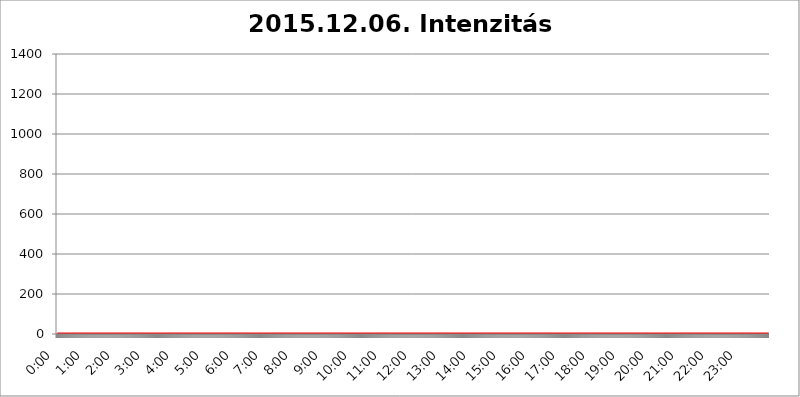
| Category | 2015.12.06. Intenzitás [W/m^2] |
|---|---|
| 0.0 | 0 |
| 0.0006944444444444445 | 0 |
| 0.001388888888888889 | 0 |
| 0.0020833333333333333 | 0 |
| 0.002777777777777778 | 0 |
| 0.003472222222222222 | 0 |
| 0.004166666666666667 | 0 |
| 0.004861111111111111 | 0 |
| 0.005555555555555556 | 0 |
| 0.0062499999999999995 | 0 |
| 0.006944444444444444 | 0 |
| 0.007638888888888889 | 0 |
| 0.008333333333333333 | 0 |
| 0.009027777777777779 | 0 |
| 0.009722222222222222 | 0 |
| 0.010416666666666666 | 0 |
| 0.011111111111111112 | 0 |
| 0.011805555555555555 | 0 |
| 0.012499999999999999 | 0 |
| 0.013194444444444444 | 0 |
| 0.013888888888888888 | 0 |
| 0.014583333333333332 | 0 |
| 0.015277777777777777 | 0 |
| 0.015972222222222224 | 0 |
| 0.016666666666666666 | 0 |
| 0.017361111111111112 | 0 |
| 0.018055555555555557 | 0 |
| 0.01875 | 0 |
| 0.019444444444444445 | 0 |
| 0.02013888888888889 | 0 |
| 0.020833333333333332 | 0 |
| 0.02152777777777778 | 0 |
| 0.022222222222222223 | 0 |
| 0.02291666666666667 | 0 |
| 0.02361111111111111 | 0 |
| 0.024305555555555556 | 0 |
| 0.024999999999999998 | 0 |
| 0.025694444444444447 | 0 |
| 0.02638888888888889 | 0 |
| 0.027083333333333334 | 0 |
| 0.027777777777777776 | 0 |
| 0.02847222222222222 | 0 |
| 0.029166666666666664 | 0 |
| 0.029861111111111113 | 0 |
| 0.030555555555555555 | 0 |
| 0.03125 | 0 |
| 0.03194444444444445 | 0 |
| 0.03263888888888889 | 0 |
| 0.03333333333333333 | 0 |
| 0.034027777777777775 | 0 |
| 0.034722222222222224 | 0 |
| 0.035416666666666666 | 0 |
| 0.036111111111111115 | 0 |
| 0.03680555555555556 | 0 |
| 0.0375 | 0 |
| 0.03819444444444444 | 0 |
| 0.03888888888888889 | 0 |
| 0.03958333333333333 | 0 |
| 0.04027777777777778 | 0 |
| 0.04097222222222222 | 0 |
| 0.041666666666666664 | 0 |
| 0.042361111111111106 | 0 |
| 0.04305555555555556 | 0 |
| 0.043750000000000004 | 0 |
| 0.044444444444444446 | 0 |
| 0.04513888888888889 | 0 |
| 0.04583333333333334 | 0 |
| 0.04652777777777778 | 0 |
| 0.04722222222222222 | 0 |
| 0.04791666666666666 | 0 |
| 0.04861111111111111 | 0 |
| 0.049305555555555554 | 0 |
| 0.049999999999999996 | 0 |
| 0.05069444444444445 | 0 |
| 0.051388888888888894 | 0 |
| 0.052083333333333336 | 0 |
| 0.05277777777777778 | 0 |
| 0.05347222222222222 | 0 |
| 0.05416666666666667 | 0 |
| 0.05486111111111111 | 0 |
| 0.05555555555555555 | 0 |
| 0.05625 | 0 |
| 0.05694444444444444 | 0 |
| 0.057638888888888885 | 0 |
| 0.05833333333333333 | 0 |
| 0.05902777777777778 | 0 |
| 0.059722222222222225 | 0 |
| 0.06041666666666667 | 0 |
| 0.061111111111111116 | 0 |
| 0.06180555555555556 | 0 |
| 0.0625 | 0 |
| 0.06319444444444444 | 0 |
| 0.06388888888888888 | 0 |
| 0.06458333333333334 | 0 |
| 0.06527777777777778 | 0 |
| 0.06597222222222222 | 0 |
| 0.06666666666666667 | 0 |
| 0.06736111111111111 | 0 |
| 0.06805555555555555 | 0 |
| 0.06874999999999999 | 0 |
| 0.06944444444444443 | 0 |
| 0.07013888888888889 | 0 |
| 0.07083333333333333 | 0 |
| 0.07152777777777779 | 0 |
| 0.07222222222222223 | 0 |
| 0.07291666666666667 | 0 |
| 0.07361111111111111 | 0 |
| 0.07430555555555556 | 0 |
| 0.075 | 0 |
| 0.07569444444444444 | 0 |
| 0.0763888888888889 | 0 |
| 0.07708333333333334 | 0 |
| 0.07777777777777778 | 0 |
| 0.07847222222222222 | 0 |
| 0.07916666666666666 | 0 |
| 0.0798611111111111 | 0 |
| 0.08055555555555556 | 0 |
| 0.08125 | 0 |
| 0.08194444444444444 | 0 |
| 0.08263888888888889 | 0 |
| 0.08333333333333333 | 0 |
| 0.08402777777777777 | 0 |
| 0.08472222222222221 | 0 |
| 0.08541666666666665 | 0 |
| 0.08611111111111112 | 0 |
| 0.08680555555555557 | 0 |
| 0.08750000000000001 | 0 |
| 0.08819444444444445 | 0 |
| 0.08888888888888889 | 0 |
| 0.08958333333333333 | 0 |
| 0.09027777777777778 | 0 |
| 0.09097222222222222 | 0 |
| 0.09166666666666667 | 0 |
| 0.09236111111111112 | 0 |
| 0.09305555555555556 | 0 |
| 0.09375 | 0 |
| 0.09444444444444444 | 0 |
| 0.09513888888888888 | 0 |
| 0.09583333333333333 | 0 |
| 0.09652777777777777 | 0 |
| 0.09722222222222222 | 0 |
| 0.09791666666666667 | 0 |
| 0.09861111111111111 | 0 |
| 0.09930555555555555 | 0 |
| 0.09999999999999999 | 0 |
| 0.10069444444444443 | 0 |
| 0.1013888888888889 | 0 |
| 0.10208333333333335 | 0 |
| 0.10277777777777779 | 0 |
| 0.10347222222222223 | 0 |
| 0.10416666666666667 | 0 |
| 0.10486111111111111 | 0 |
| 0.10555555555555556 | 0 |
| 0.10625 | 0 |
| 0.10694444444444444 | 0 |
| 0.1076388888888889 | 0 |
| 0.10833333333333334 | 0 |
| 0.10902777777777778 | 0 |
| 0.10972222222222222 | 0 |
| 0.1111111111111111 | 0 |
| 0.11180555555555556 | 0 |
| 0.11180555555555556 | 0 |
| 0.1125 | 0 |
| 0.11319444444444444 | 0 |
| 0.11388888888888889 | 0 |
| 0.11458333333333333 | 0 |
| 0.11527777777777777 | 0 |
| 0.11597222222222221 | 0 |
| 0.11666666666666665 | 0 |
| 0.1173611111111111 | 0 |
| 0.11805555555555557 | 0 |
| 0.11944444444444445 | 0 |
| 0.12013888888888889 | 0 |
| 0.12083333333333333 | 0 |
| 0.12152777777777778 | 0 |
| 0.12222222222222223 | 0 |
| 0.12291666666666667 | 0 |
| 0.12291666666666667 | 0 |
| 0.12361111111111112 | 0 |
| 0.12430555555555556 | 0 |
| 0.125 | 0 |
| 0.12569444444444444 | 0 |
| 0.12638888888888888 | 0 |
| 0.12708333333333333 | 0 |
| 0.16875 | 0 |
| 0.12847222222222224 | 0 |
| 0.12916666666666668 | 0 |
| 0.12986111111111112 | 0 |
| 0.13055555555555556 | 0 |
| 0.13125 | 0 |
| 0.13194444444444445 | 0 |
| 0.1326388888888889 | 0 |
| 0.13333333333333333 | 0 |
| 0.13402777777777777 | 0 |
| 0.13402777777777777 | 0 |
| 0.13472222222222222 | 0 |
| 0.13541666666666666 | 0 |
| 0.1361111111111111 | 0 |
| 0.13749999999999998 | 0 |
| 0.13819444444444443 | 0 |
| 0.1388888888888889 | 0 |
| 0.13958333333333334 | 0 |
| 0.14027777777777778 | 0 |
| 0.14097222222222222 | 0 |
| 0.14166666666666666 | 0 |
| 0.1423611111111111 | 0 |
| 0.14305555555555557 | 0 |
| 0.14375000000000002 | 0 |
| 0.14444444444444446 | 0 |
| 0.1451388888888889 | 0 |
| 0.1451388888888889 | 0 |
| 0.14652777777777778 | 0 |
| 0.14722222222222223 | 0 |
| 0.14791666666666667 | 0 |
| 0.1486111111111111 | 0 |
| 0.14930555555555555 | 0 |
| 0.15 | 0 |
| 0.15069444444444444 | 0 |
| 0.15138888888888888 | 0 |
| 0.15208333333333332 | 0 |
| 0.15277777777777776 | 0 |
| 0.15347222222222223 | 0 |
| 0.15416666666666667 | 0 |
| 0.15486111111111112 | 0 |
| 0.15555555555555556 | 0 |
| 0.15625 | 0 |
| 0.15694444444444444 | 0 |
| 0.15763888888888888 | 0 |
| 0.15833333333333333 | 0 |
| 0.15902777777777777 | 0 |
| 0.15972222222222224 | 0 |
| 0.16041666666666668 | 0 |
| 0.16111111111111112 | 0 |
| 0.16180555555555556 | 0 |
| 0.1625 | 0 |
| 0.16319444444444445 | 0 |
| 0.1638888888888889 | 0 |
| 0.16458333333333333 | 0 |
| 0.16527777777777777 | 0 |
| 0.16597222222222222 | 0 |
| 0.16666666666666666 | 0 |
| 0.1673611111111111 | 0 |
| 0.16805555555555554 | 0 |
| 0.16874999999999998 | 0 |
| 0.16944444444444443 | 0 |
| 0.17013888888888887 | 0 |
| 0.1708333333333333 | 0 |
| 0.17152777777777775 | 0 |
| 0.17222222222222225 | 0 |
| 0.1729166666666667 | 0 |
| 0.17361111111111113 | 0 |
| 0.17430555555555557 | 0 |
| 0.17500000000000002 | 0 |
| 0.17569444444444446 | 0 |
| 0.1763888888888889 | 0 |
| 0.17708333333333334 | 0 |
| 0.17777777777777778 | 0 |
| 0.17847222222222223 | 0 |
| 0.17916666666666667 | 0 |
| 0.1798611111111111 | 0 |
| 0.18055555555555555 | 0 |
| 0.18125 | 0 |
| 0.18194444444444444 | 0 |
| 0.1826388888888889 | 0 |
| 0.18333333333333335 | 0 |
| 0.1840277777777778 | 0 |
| 0.18472222222222223 | 0 |
| 0.18541666666666667 | 0 |
| 0.18611111111111112 | 0 |
| 0.18680555555555556 | 0 |
| 0.1875 | 0 |
| 0.18819444444444444 | 0 |
| 0.18888888888888888 | 0 |
| 0.18958333333333333 | 0 |
| 0.19027777777777777 | 0 |
| 0.1909722222222222 | 0 |
| 0.19166666666666665 | 0 |
| 0.19236111111111112 | 0 |
| 0.19305555555555554 | 0 |
| 0.19375 | 0 |
| 0.19444444444444445 | 0 |
| 0.1951388888888889 | 0 |
| 0.19583333333333333 | 0 |
| 0.19652777777777777 | 0 |
| 0.19722222222222222 | 0 |
| 0.19791666666666666 | 0 |
| 0.1986111111111111 | 0 |
| 0.19930555555555554 | 0 |
| 0.19999999999999998 | 0 |
| 0.20069444444444443 | 0 |
| 0.20138888888888887 | 0 |
| 0.2020833333333333 | 0 |
| 0.2027777777777778 | 0 |
| 0.2034722222222222 | 0 |
| 0.2041666666666667 | 0 |
| 0.20486111111111113 | 0 |
| 0.20555555555555557 | 0 |
| 0.20625000000000002 | 0 |
| 0.20694444444444446 | 0 |
| 0.2076388888888889 | 0 |
| 0.20833333333333334 | 0 |
| 0.20902777777777778 | 0 |
| 0.20972222222222223 | 0 |
| 0.21041666666666667 | 0 |
| 0.2111111111111111 | 0 |
| 0.21180555555555555 | 0 |
| 0.2125 | 0 |
| 0.21319444444444444 | 0 |
| 0.2138888888888889 | 0 |
| 0.21458333333333335 | 0 |
| 0.2152777777777778 | 0 |
| 0.21597222222222223 | 0 |
| 0.21666666666666667 | 0 |
| 0.21736111111111112 | 0 |
| 0.21805555555555556 | 0 |
| 0.21875 | 0 |
| 0.21944444444444444 | 0 |
| 0.22013888888888888 | 0 |
| 0.22083333333333333 | 0 |
| 0.22152777777777777 | 0 |
| 0.2222222222222222 | 0 |
| 0.22291666666666665 | 0 |
| 0.2236111111111111 | 0 |
| 0.22430555555555556 | 0 |
| 0.225 | 0 |
| 0.22569444444444445 | 0 |
| 0.2263888888888889 | 0 |
| 0.22708333333333333 | 0 |
| 0.22777777777777777 | 0 |
| 0.22847222222222222 | 0 |
| 0.22916666666666666 | 0 |
| 0.2298611111111111 | 0 |
| 0.23055555555555554 | 0 |
| 0.23124999999999998 | 0 |
| 0.23194444444444443 | 0 |
| 0.23263888888888887 | 0 |
| 0.2333333333333333 | 0 |
| 0.2340277777777778 | 0 |
| 0.2347222222222222 | 0 |
| 0.2354166666666667 | 0 |
| 0.23611111111111113 | 0 |
| 0.23680555555555557 | 0 |
| 0.23750000000000002 | 0 |
| 0.23819444444444446 | 0 |
| 0.2388888888888889 | 0 |
| 0.23958333333333334 | 0 |
| 0.24027777777777778 | 0 |
| 0.24097222222222223 | 0 |
| 0.24166666666666667 | 0 |
| 0.2423611111111111 | 0 |
| 0.24305555555555555 | 0 |
| 0.24375 | 0 |
| 0.24444444444444446 | 0 |
| 0.24513888888888888 | 0 |
| 0.24583333333333335 | 0 |
| 0.2465277777777778 | 0 |
| 0.24722222222222223 | 0 |
| 0.24791666666666667 | 0 |
| 0.24861111111111112 | 0 |
| 0.24930555555555556 | 0 |
| 0.25 | 0 |
| 0.25069444444444444 | 0 |
| 0.2513888888888889 | 0 |
| 0.2520833333333333 | 0 |
| 0.25277777777777777 | 0 |
| 0.2534722222222222 | 0 |
| 0.25416666666666665 | 0 |
| 0.2548611111111111 | 0 |
| 0.2555555555555556 | 0 |
| 0.25625000000000003 | 0 |
| 0.2569444444444445 | 0 |
| 0.2576388888888889 | 0 |
| 0.25833333333333336 | 0 |
| 0.2590277777777778 | 0 |
| 0.25972222222222224 | 0 |
| 0.2604166666666667 | 0 |
| 0.2611111111111111 | 0 |
| 0.26180555555555557 | 0 |
| 0.2625 | 0 |
| 0.26319444444444445 | 0 |
| 0.2638888888888889 | 0 |
| 0.26458333333333334 | 0 |
| 0.2652777777777778 | 0 |
| 0.2659722222222222 | 0 |
| 0.26666666666666666 | 0 |
| 0.2673611111111111 | 0 |
| 0.26805555555555555 | 0 |
| 0.26875 | 0 |
| 0.26944444444444443 | 0 |
| 0.2701388888888889 | 0 |
| 0.2708333333333333 | 0 |
| 0.27152777777777776 | 0 |
| 0.2722222222222222 | 0 |
| 0.27291666666666664 | 0 |
| 0.2736111111111111 | 0 |
| 0.2743055555555555 | 0 |
| 0.27499999999999997 | 0 |
| 0.27569444444444446 | 0 |
| 0.27638888888888885 | 0 |
| 0.27708333333333335 | 0 |
| 0.2777777777777778 | 0 |
| 0.27847222222222223 | 0 |
| 0.2791666666666667 | 0 |
| 0.2798611111111111 | 0 |
| 0.28055555555555556 | 0 |
| 0.28125 | 0 |
| 0.28194444444444444 | 0 |
| 0.2826388888888889 | 0 |
| 0.2833333333333333 | 0 |
| 0.28402777777777777 | 0 |
| 0.2847222222222222 | 0 |
| 0.28541666666666665 | 0 |
| 0.28611111111111115 | 0 |
| 0.28680555555555554 | 0 |
| 0.28750000000000003 | 0 |
| 0.2881944444444445 | 0 |
| 0.2888888888888889 | 0 |
| 0.28958333333333336 | 0 |
| 0.2902777777777778 | 0 |
| 0.29097222222222224 | 0 |
| 0.2916666666666667 | 0 |
| 0.2923611111111111 | 0 |
| 0.29305555555555557 | 0 |
| 0.29375 | 0 |
| 0.29444444444444445 | 0 |
| 0.2951388888888889 | 0 |
| 0.29583333333333334 | 0 |
| 0.2965277777777778 | 0 |
| 0.2972222222222222 | 0 |
| 0.29791666666666666 | 0 |
| 0.2986111111111111 | 0 |
| 0.29930555555555555 | 0 |
| 0.3 | 0 |
| 0.30069444444444443 | 0 |
| 0.3013888888888889 | 0 |
| 0.3020833333333333 | 0 |
| 0.30277777777777776 | 0 |
| 0.3034722222222222 | 0 |
| 0.30416666666666664 | 0 |
| 0.3048611111111111 | 0 |
| 0.3055555555555555 | 0 |
| 0.30624999999999997 | 0 |
| 0.3069444444444444 | 0 |
| 0.3076388888888889 | 0 |
| 0.30833333333333335 | 0 |
| 0.3090277777777778 | 0 |
| 0.30972222222222223 | 0 |
| 0.3104166666666667 | 0 |
| 0.3111111111111111 | 0 |
| 0.31180555555555556 | 0 |
| 0.3125 | 0 |
| 0.31319444444444444 | 0 |
| 0.3138888888888889 | 0 |
| 0.3145833333333333 | 0 |
| 0.31527777777777777 | 0 |
| 0.3159722222222222 | 0 |
| 0.31666666666666665 | 0 |
| 0.31736111111111115 | 0 |
| 0.31805555555555554 | 0 |
| 0.31875000000000003 | 0 |
| 0.3194444444444445 | 0 |
| 0.3201388888888889 | 0 |
| 0.32083333333333336 | 0 |
| 0.3215277777777778 | 0 |
| 0.32222222222222224 | 0 |
| 0.3229166666666667 | 0 |
| 0.3236111111111111 | 0 |
| 0.32430555555555557 | 0 |
| 0.325 | 0 |
| 0.32569444444444445 | 0 |
| 0.3263888888888889 | 0 |
| 0.32708333333333334 | 0 |
| 0.3277777777777778 | 0 |
| 0.3284722222222222 | 0 |
| 0.32916666666666666 | 0 |
| 0.3298611111111111 | 0 |
| 0.33055555555555555 | 0 |
| 0.33125 | 0 |
| 0.33194444444444443 | 0 |
| 0.3326388888888889 | 0 |
| 0.3333333333333333 | 0 |
| 0.3340277777777778 | 0 |
| 0.3347222222222222 | 0 |
| 0.3354166666666667 | 0 |
| 0.3361111111111111 | 0 |
| 0.3368055555555556 | 0 |
| 0.33749999999999997 | 0 |
| 0.33819444444444446 | 0 |
| 0.33888888888888885 | 0 |
| 0.33958333333333335 | 0 |
| 0.34027777777777773 | 0 |
| 0.34097222222222223 | 0 |
| 0.3416666666666666 | 0 |
| 0.3423611111111111 | 0 |
| 0.3430555555555555 | 0 |
| 0.34375 | 0 |
| 0.3444444444444445 | 0 |
| 0.3451388888888889 | 0 |
| 0.3458333333333334 | 0 |
| 0.34652777777777777 | 0 |
| 0.34722222222222227 | 0 |
| 0.34791666666666665 | 0 |
| 0.34861111111111115 | 0 |
| 0.34930555555555554 | 0 |
| 0.35000000000000003 | 0 |
| 0.3506944444444444 | 0 |
| 0.3513888888888889 | 0 |
| 0.3520833333333333 | 0 |
| 0.3527777777777778 | 0 |
| 0.3534722222222222 | 0 |
| 0.3541666666666667 | 0 |
| 0.3548611111111111 | 0 |
| 0.35555555555555557 | 0 |
| 0.35625 | 0 |
| 0.35694444444444445 | 0 |
| 0.3576388888888889 | 0 |
| 0.35833333333333334 | 0 |
| 0.3590277777777778 | 0 |
| 0.3597222222222222 | 0 |
| 0.36041666666666666 | 0 |
| 0.3611111111111111 | 0 |
| 0.36180555555555555 | 0 |
| 0.3625 | 0 |
| 0.36319444444444443 | 0 |
| 0.3638888888888889 | 0 |
| 0.3645833333333333 | 0 |
| 0.3652777777777778 | 0 |
| 0.3659722222222222 | 0 |
| 0.3666666666666667 | 0 |
| 0.3673611111111111 | 0 |
| 0.3680555555555556 | 0 |
| 0.36874999999999997 | 0 |
| 0.36944444444444446 | 0 |
| 0.37013888888888885 | 0 |
| 0.37083333333333335 | 0 |
| 0.37152777777777773 | 0 |
| 0.37222222222222223 | 0 |
| 0.3729166666666666 | 0 |
| 0.3736111111111111 | 0 |
| 0.3743055555555555 | 0 |
| 0.375 | 0 |
| 0.3756944444444445 | 0 |
| 0.3763888888888889 | 0 |
| 0.3770833333333334 | 0 |
| 0.37777777777777777 | 0 |
| 0.37847222222222227 | 0 |
| 0.37916666666666665 | 0 |
| 0.37986111111111115 | 0 |
| 0.38055555555555554 | 0 |
| 0.38125000000000003 | 0 |
| 0.3819444444444444 | 0 |
| 0.3826388888888889 | 0 |
| 0.3833333333333333 | 0 |
| 0.3840277777777778 | 0 |
| 0.3847222222222222 | 0 |
| 0.3854166666666667 | 0 |
| 0.3861111111111111 | 0 |
| 0.38680555555555557 | 0 |
| 0.3875 | 0 |
| 0.38819444444444445 | 0 |
| 0.3888888888888889 | 0 |
| 0.38958333333333334 | 0 |
| 0.3902777777777778 | 0 |
| 0.3909722222222222 | 0 |
| 0.39166666666666666 | 0 |
| 0.3923611111111111 | 0 |
| 0.39305555555555555 | 0 |
| 0.39375 | 0 |
| 0.39444444444444443 | 0 |
| 0.3951388888888889 | 0 |
| 0.3958333333333333 | 0 |
| 0.3965277777777778 | 0 |
| 0.3972222222222222 | 0 |
| 0.3979166666666667 | 0 |
| 0.3986111111111111 | 0 |
| 0.3993055555555556 | 0 |
| 0.39999999999999997 | 0 |
| 0.40069444444444446 | 0 |
| 0.40138888888888885 | 0 |
| 0.40208333333333335 | 0 |
| 0.40277777777777773 | 0 |
| 0.40347222222222223 | 0 |
| 0.4041666666666666 | 0 |
| 0.4048611111111111 | 0 |
| 0.4055555555555555 | 0 |
| 0.40625 | 0 |
| 0.4069444444444445 | 0 |
| 0.4076388888888889 | 0 |
| 0.4083333333333334 | 0 |
| 0.40902777777777777 | 0 |
| 0.40972222222222227 | 0 |
| 0.41041666666666665 | 0 |
| 0.41111111111111115 | 0 |
| 0.41180555555555554 | 0 |
| 0.41250000000000003 | 0 |
| 0.4131944444444444 | 0 |
| 0.4138888888888889 | 0 |
| 0.4145833333333333 | 0 |
| 0.4152777777777778 | 0 |
| 0.4159722222222222 | 0 |
| 0.4166666666666667 | 0 |
| 0.4173611111111111 | 0 |
| 0.41805555555555557 | 0 |
| 0.41875 | 0 |
| 0.41944444444444445 | 0 |
| 0.4201388888888889 | 0 |
| 0.42083333333333334 | 0 |
| 0.4215277777777778 | 0 |
| 0.4222222222222222 | 0 |
| 0.42291666666666666 | 0 |
| 0.4236111111111111 | 0 |
| 0.42430555555555555 | 0 |
| 0.425 | 0 |
| 0.42569444444444443 | 0 |
| 0.4263888888888889 | 0 |
| 0.4270833333333333 | 0 |
| 0.4277777777777778 | 0 |
| 0.4284722222222222 | 0 |
| 0.4291666666666667 | 0 |
| 0.4298611111111111 | 0 |
| 0.4305555555555556 | 0 |
| 0.43124999999999997 | 0 |
| 0.43194444444444446 | 0 |
| 0.43263888888888885 | 0 |
| 0.43333333333333335 | 0 |
| 0.43402777777777773 | 0 |
| 0.43472222222222223 | 0 |
| 0.4354166666666666 | 0 |
| 0.4361111111111111 | 0 |
| 0.4368055555555555 | 0 |
| 0.4375 | 0 |
| 0.4381944444444445 | 0 |
| 0.4388888888888889 | 0 |
| 0.4395833333333334 | 0 |
| 0.44027777777777777 | 0 |
| 0.44097222222222227 | 0 |
| 0.44166666666666665 | 0 |
| 0.44236111111111115 | 0 |
| 0.44305555555555554 | 0 |
| 0.44375000000000003 | 0 |
| 0.4444444444444444 | 0 |
| 0.4451388888888889 | 0 |
| 0.4458333333333333 | 0 |
| 0.4465277777777778 | 0 |
| 0.4472222222222222 | 0 |
| 0.4479166666666667 | 0 |
| 0.4486111111111111 | 0 |
| 0.44930555555555557 | 0 |
| 0.45 | 0 |
| 0.45069444444444445 | 0 |
| 0.4513888888888889 | 0 |
| 0.45208333333333334 | 0 |
| 0.4527777777777778 | 0 |
| 0.4534722222222222 | 0 |
| 0.45416666666666666 | 0 |
| 0.4548611111111111 | 0 |
| 0.45555555555555555 | 0 |
| 0.45625 | 0 |
| 0.45694444444444443 | 0 |
| 0.4576388888888889 | 0 |
| 0.4583333333333333 | 0 |
| 0.4590277777777778 | 0 |
| 0.4597222222222222 | 0 |
| 0.4604166666666667 | 0 |
| 0.4611111111111111 | 0 |
| 0.4618055555555556 | 0 |
| 0.46249999999999997 | 0 |
| 0.46319444444444446 | 0 |
| 0.46388888888888885 | 0 |
| 0.46458333333333335 | 0 |
| 0.46527777777777773 | 0 |
| 0.46597222222222223 | 0 |
| 0.4666666666666666 | 0 |
| 0.4673611111111111 | 0 |
| 0.4680555555555555 | 0 |
| 0.46875 | 0 |
| 0.4694444444444445 | 0 |
| 0.4701388888888889 | 0 |
| 0.4708333333333334 | 0 |
| 0.47152777777777777 | 0 |
| 0.47222222222222227 | 0 |
| 0.47291666666666665 | 0 |
| 0.47361111111111115 | 0 |
| 0.47430555555555554 | 0 |
| 0.47500000000000003 | 0 |
| 0.4756944444444444 | 0 |
| 0.4763888888888889 | 0 |
| 0.4770833333333333 | 0 |
| 0.4777777777777778 | 0 |
| 0.4784722222222222 | 0 |
| 0.4791666666666667 | 0 |
| 0.4798611111111111 | 0 |
| 0.48055555555555557 | 0 |
| 0.48125 | 0 |
| 0.48194444444444445 | 0 |
| 0.4826388888888889 | 0 |
| 0.48333333333333334 | 0 |
| 0.4840277777777778 | 0 |
| 0.4847222222222222 | 0 |
| 0.48541666666666666 | 0 |
| 0.4861111111111111 | 0 |
| 0.48680555555555555 | 0 |
| 0.4875 | 0 |
| 0.48819444444444443 | 0 |
| 0.4888888888888889 | 0 |
| 0.4895833333333333 | 0 |
| 0.4902777777777778 | 0 |
| 0.4909722222222222 | 0 |
| 0.4916666666666667 | 0 |
| 0.4923611111111111 | 0 |
| 0.4930555555555556 | 0 |
| 0.49374999999999997 | 0 |
| 0.49444444444444446 | 0 |
| 0.49513888888888885 | 0 |
| 0.49583333333333335 | 0 |
| 0.49652777777777773 | 0 |
| 0.49722222222222223 | 0 |
| 0.4979166666666666 | 0 |
| 0.4986111111111111 | 0 |
| 0.4993055555555555 | 0 |
| 0.5 | 0 |
| 0.5006944444444444 | 0 |
| 0.5013888888888889 | 0 |
| 0.5020833333333333 | 0 |
| 0.5027777777777778 | 0 |
| 0.5034722222222222 | 0 |
| 0.5041666666666667 | 0 |
| 0.5048611111111111 | 0 |
| 0.5055555555555555 | 0 |
| 0.50625 | 0 |
| 0.5069444444444444 | 0 |
| 0.5076388888888889 | 0 |
| 0.5083333333333333 | 0 |
| 0.5090277777777777 | 0 |
| 0.5097222222222222 | 0 |
| 0.5104166666666666 | 0 |
| 0.5111111111111112 | 0 |
| 0.5118055555555555 | 0 |
| 0.5125000000000001 | 0 |
| 0.5131944444444444 | 0 |
| 0.513888888888889 | 0 |
| 0.5145833333333333 | 0 |
| 0.5152777777777778 | 0 |
| 0.5159722222222222 | 0 |
| 0.5166666666666667 | 0 |
| 0.517361111111111 | 0 |
| 0.5180555555555556 | 0 |
| 0.5187499999999999 | 0 |
| 0.5194444444444445 | 0 |
| 0.5201388888888888 | 0 |
| 0.5208333333333334 | 0 |
| 0.5215277777777778 | 0 |
| 0.5222222222222223 | 0 |
| 0.5229166666666667 | 0 |
| 0.5236111111111111 | 0 |
| 0.5243055555555556 | 0 |
| 0.525 | 0 |
| 0.5256944444444445 | 0 |
| 0.5263888888888889 | 0 |
| 0.5270833333333333 | 0 |
| 0.5277777777777778 | 0 |
| 0.5284722222222222 | 0 |
| 0.5291666666666667 | 0 |
| 0.5298611111111111 | 0 |
| 0.5305555555555556 | 0 |
| 0.53125 | 0 |
| 0.5319444444444444 | 0 |
| 0.5326388888888889 | 0 |
| 0.5333333333333333 | 0 |
| 0.5340277777777778 | 0 |
| 0.5347222222222222 | 0 |
| 0.5354166666666667 | 0 |
| 0.5361111111111111 | 0 |
| 0.5368055555555555 | 0 |
| 0.5375 | 0 |
| 0.5381944444444444 | 0 |
| 0.5388888888888889 | 0 |
| 0.5395833333333333 | 0 |
| 0.5402777777777777 | 0 |
| 0.5409722222222222 | 0 |
| 0.5416666666666666 | 0 |
| 0.5423611111111112 | 0 |
| 0.5430555555555555 | 0 |
| 0.5437500000000001 | 0 |
| 0.5444444444444444 | 0 |
| 0.545138888888889 | 0 |
| 0.5458333333333333 | 0 |
| 0.5465277777777778 | 0 |
| 0.5472222222222222 | 0 |
| 0.5479166666666667 | 0 |
| 0.548611111111111 | 0 |
| 0.5493055555555556 | 0 |
| 0.5499999999999999 | 0 |
| 0.5506944444444445 | 0 |
| 0.5513888888888888 | 0 |
| 0.5520833333333334 | 0 |
| 0.5527777777777778 | 0 |
| 0.5534722222222223 | 0 |
| 0.5541666666666667 | 0 |
| 0.5548611111111111 | 0 |
| 0.5555555555555556 | 0 |
| 0.55625 | 0 |
| 0.5569444444444445 | 0 |
| 0.5576388888888889 | 0 |
| 0.5583333333333333 | 0 |
| 0.5590277777777778 | 0 |
| 0.5597222222222222 | 0 |
| 0.5604166666666667 | 0 |
| 0.5611111111111111 | 0 |
| 0.5618055555555556 | 0 |
| 0.5625 | 0 |
| 0.5631944444444444 | 0 |
| 0.5638888888888889 | 0 |
| 0.5645833333333333 | 0 |
| 0.5652777777777778 | 0 |
| 0.5659722222222222 | 0 |
| 0.5666666666666667 | 0 |
| 0.5673611111111111 | 0 |
| 0.5680555555555555 | 0 |
| 0.56875 | 0 |
| 0.5694444444444444 | 0 |
| 0.5701388888888889 | 0 |
| 0.5708333333333333 | 0 |
| 0.5715277777777777 | 0 |
| 0.5722222222222222 | 0 |
| 0.5729166666666666 | 0 |
| 0.5736111111111112 | 0 |
| 0.5743055555555555 | 0 |
| 0.5750000000000001 | 0 |
| 0.5756944444444444 | 0 |
| 0.576388888888889 | 0 |
| 0.5770833333333333 | 0 |
| 0.5777777777777778 | 0 |
| 0.5784722222222222 | 0 |
| 0.5791666666666667 | 0 |
| 0.579861111111111 | 0 |
| 0.5805555555555556 | 0 |
| 0.5812499999999999 | 0 |
| 0.5819444444444445 | 0 |
| 0.5826388888888888 | 0 |
| 0.5833333333333334 | 0 |
| 0.5840277777777778 | 0 |
| 0.5847222222222223 | 0 |
| 0.5854166666666667 | 0 |
| 0.5861111111111111 | 0 |
| 0.5868055555555556 | 0 |
| 0.5875 | 0 |
| 0.5881944444444445 | 0 |
| 0.5888888888888889 | 0 |
| 0.5895833333333333 | 0 |
| 0.5902777777777778 | 0 |
| 0.5909722222222222 | 0 |
| 0.5916666666666667 | 0 |
| 0.5923611111111111 | 0 |
| 0.5930555555555556 | 0 |
| 0.59375 | 0 |
| 0.5944444444444444 | 0 |
| 0.5951388888888889 | 0 |
| 0.5958333333333333 | 0 |
| 0.5965277777777778 | 0 |
| 0.5972222222222222 | 0 |
| 0.5979166666666667 | 0 |
| 0.5986111111111111 | 0 |
| 0.5993055555555555 | 0 |
| 0.6 | 0 |
| 0.6006944444444444 | 0 |
| 0.6013888888888889 | 0 |
| 0.6020833333333333 | 0 |
| 0.6027777777777777 | 0 |
| 0.6034722222222222 | 0 |
| 0.6041666666666666 | 0 |
| 0.6048611111111112 | 0 |
| 0.6055555555555555 | 0 |
| 0.6062500000000001 | 0 |
| 0.6069444444444444 | 0 |
| 0.607638888888889 | 0 |
| 0.6083333333333333 | 0 |
| 0.6090277777777778 | 0 |
| 0.6097222222222222 | 0 |
| 0.6104166666666667 | 0 |
| 0.611111111111111 | 0 |
| 0.6118055555555556 | 0 |
| 0.6124999999999999 | 0 |
| 0.6131944444444445 | 0 |
| 0.6138888888888888 | 0 |
| 0.6145833333333334 | 0 |
| 0.6152777777777778 | 0 |
| 0.6159722222222223 | 0 |
| 0.6166666666666667 | 0 |
| 0.6173611111111111 | 0 |
| 0.6180555555555556 | 0 |
| 0.61875 | 0 |
| 0.6194444444444445 | 0 |
| 0.6201388888888889 | 0 |
| 0.6208333333333333 | 0 |
| 0.6215277777777778 | 0 |
| 0.6222222222222222 | 0 |
| 0.6229166666666667 | 0 |
| 0.6236111111111111 | 0 |
| 0.6243055555555556 | 0 |
| 0.625 | 0 |
| 0.6256944444444444 | 0 |
| 0.6263888888888889 | 0 |
| 0.6270833333333333 | 0 |
| 0.6277777777777778 | 0 |
| 0.6284722222222222 | 0 |
| 0.6291666666666667 | 0 |
| 0.6298611111111111 | 0 |
| 0.6305555555555555 | 0 |
| 0.63125 | 0 |
| 0.6319444444444444 | 0 |
| 0.6326388888888889 | 0 |
| 0.6333333333333333 | 0 |
| 0.6340277777777777 | 0 |
| 0.6347222222222222 | 0 |
| 0.6354166666666666 | 0 |
| 0.6361111111111112 | 0 |
| 0.6368055555555555 | 0 |
| 0.6375000000000001 | 0 |
| 0.6381944444444444 | 0 |
| 0.638888888888889 | 0 |
| 0.6395833333333333 | 0 |
| 0.6402777777777778 | 0 |
| 0.6409722222222222 | 0 |
| 0.6416666666666667 | 0 |
| 0.642361111111111 | 0 |
| 0.6430555555555556 | 0 |
| 0.6437499999999999 | 0 |
| 0.6444444444444445 | 0 |
| 0.6451388888888888 | 0 |
| 0.6458333333333334 | 0 |
| 0.6465277777777778 | 0 |
| 0.6472222222222223 | 0 |
| 0.6479166666666667 | 0 |
| 0.6486111111111111 | 0 |
| 0.6493055555555556 | 0 |
| 0.65 | 0 |
| 0.6506944444444445 | 0 |
| 0.6513888888888889 | 0 |
| 0.6520833333333333 | 0 |
| 0.6527777777777778 | 0 |
| 0.6534722222222222 | 0 |
| 0.6541666666666667 | 0 |
| 0.6548611111111111 | 0 |
| 0.6555555555555556 | 0 |
| 0.65625 | 0 |
| 0.6569444444444444 | 0 |
| 0.6576388888888889 | 0 |
| 0.6583333333333333 | 0 |
| 0.6590277777777778 | 0 |
| 0.6597222222222222 | 0 |
| 0.6604166666666667 | 0 |
| 0.6611111111111111 | 0 |
| 0.6618055555555555 | 0 |
| 0.6625 | 0 |
| 0.6631944444444444 | 0 |
| 0.6638888888888889 | 0 |
| 0.6645833333333333 | 0 |
| 0.6652777777777777 | 0 |
| 0.6659722222222222 | 0 |
| 0.6666666666666666 | 0 |
| 0.6673611111111111 | 0 |
| 0.6680555555555556 | 0 |
| 0.6687500000000001 | 0 |
| 0.6694444444444444 | 0 |
| 0.6701388888888888 | 0 |
| 0.6708333333333334 | 0 |
| 0.6715277777777778 | 0 |
| 0.6722222222222222 | 0 |
| 0.6729166666666666 | 0 |
| 0.6736111111111112 | 0 |
| 0.6743055555555556 | 0 |
| 0.6749999999999999 | 0 |
| 0.6756944444444444 | 0 |
| 0.6763888888888889 | 0 |
| 0.6770833333333334 | 0 |
| 0.6777777777777777 | 0 |
| 0.6784722222222223 | 0 |
| 0.6791666666666667 | 0 |
| 0.6798611111111111 | 0 |
| 0.6805555555555555 | 0 |
| 0.68125 | 0 |
| 0.6819444444444445 | 0 |
| 0.6826388888888889 | 0 |
| 0.6833333333333332 | 0 |
| 0.6840277777777778 | 0 |
| 0.6847222222222222 | 0 |
| 0.6854166666666667 | 0 |
| 0.686111111111111 | 0 |
| 0.6868055555555556 | 0 |
| 0.6875 | 0 |
| 0.6881944444444444 | 0 |
| 0.688888888888889 | 0 |
| 0.6895833333333333 | 0 |
| 0.6902777777777778 | 0 |
| 0.6909722222222222 | 0 |
| 0.6916666666666668 | 0 |
| 0.6923611111111111 | 0 |
| 0.6930555555555555 | 0 |
| 0.69375 | 0 |
| 0.6944444444444445 | 0 |
| 0.6951388888888889 | 0 |
| 0.6958333333333333 | 0 |
| 0.6965277777777777 | 0 |
| 0.6972222222222223 | 0 |
| 0.6979166666666666 | 0 |
| 0.6986111111111111 | 0 |
| 0.6993055555555556 | 0 |
| 0.7000000000000001 | 0 |
| 0.7006944444444444 | 0 |
| 0.7013888888888888 | 0 |
| 0.7020833333333334 | 0 |
| 0.7027777777777778 | 0 |
| 0.7034722222222222 | 0 |
| 0.7041666666666666 | 0 |
| 0.7048611111111112 | 0 |
| 0.7055555555555556 | 0 |
| 0.7062499999999999 | 0 |
| 0.7069444444444444 | 0 |
| 0.7076388888888889 | 0 |
| 0.7083333333333334 | 0 |
| 0.7090277777777777 | 0 |
| 0.7097222222222223 | 0 |
| 0.7104166666666667 | 0 |
| 0.7111111111111111 | 0 |
| 0.7118055555555555 | 0 |
| 0.7125 | 0 |
| 0.7131944444444445 | 0 |
| 0.7138888888888889 | 0 |
| 0.7145833333333332 | 0 |
| 0.7152777777777778 | 0 |
| 0.7159722222222222 | 0 |
| 0.7166666666666667 | 0 |
| 0.717361111111111 | 0 |
| 0.7180555555555556 | 0 |
| 0.71875 | 0 |
| 0.7194444444444444 | 0 |
| 0.720138888888889 | 0 |
| 0.7208333333333333 | 0 |
| 0.7215277777777778 | 0 |
| 0.7222222222222222 | 0 |
| 0.7229166666666668 | 0 |
| 0.7236111111111111 | 0 |
| 0.7243055555555555 | 0 |
| 0.725 | 0 |
| 0.7256944444444445 | 0 |
| 0.7263888888888889 | 0 |
| 0.7270833333333333 | 0 |
| 0.7277777777777777 | 0 |
| 0.7284722222222223 | 0 |
| 0.7291666666666666 | 0 |
| 0.7298611111111111 | 0 |
| 0.7305555555555556 | 0 |
| 0.7312500000000001 | 0 |
| 0.7319444444444444 | 0 |
| 0.7326388888888888 | 0 |
| 0.7333333333333334 | 0 |
| 0.7340277777777778 | 0 |
| 0.7347222222222222 | 0 |
| 0.7354166666666666 | 0 |
| 0.7361111111111112 | 0 |
| 0.7368055555555556 | 0 |
| 0.7374999999999999 | 0 |
| 0.7381944444444444 | 0 |
| 0.7388888888888889 | 0 |
| 0.7395833333333334 | 0 |
| 0.7402777777777777 | 0 |
| 0.7409722222222223 | 0 |
| 0.7416666666666667 | 0 |
| 0.7423611111111111 | 0 |
| 0.7430555555555555 | 0 |
| 0.74375 | 0 |
| 0.7444444444444445 | 0 |
| 0.7451388888888889 | 0 |
| 0.7458333333333332 | 0 |
| 0.7465277777777778 | 0 |
| 0.7472222222222222 | 0 |
| 0.7479166666666667 | 0 |
| 0.748611111111111 | 0 |
| 0.7493055555555556 | 0 |
| 0.75 | 0 |
| 0.7506944444444444 | 0 |
| 0.751388888888889 | 0 |
| 0.7520833333333333 | 0 |
| 0.7527777777777778 | 0 |
| 0.7534722222222222 | 0 |
| 0.7541666666666668 | 0 |
| 0.7548611111111111 | 0 |
| 0.7555555555555555 | 0 |
| 0.75625 | 0 |
| 0.7569444444444445 | 0 |
| 0.7576388888888889 | 0 |
| 0.7583333333333333 | 0 |
| 0.7590277777777777 | 0 |
| 0.7597222222222223 | 0 |
| 0.7604166666666666 | 0 |
| 0.7611111111111111 | 0 |
| 0.7618055555555556 | 0 |
| 0.7625000000000001 | 0 |
| 0.7631944444444444 | 0 |
| 0.7638888888888888 | 0 |
| 0.7645833333333334 | 0 |
| 0.7652777777777778 | 0 |
| 0.7659722222222222 | 0 |
| 0.7666666666666666 | 0 |
| 0.7673611111111112 | 0 |
| 0.7680555555555556 | 0 |
| 0.7687499999999999 | 0 |
| 0.7694444444444444 | 0 |
| 0.7701388888888889 | 0 |
| 0.7708333333333334 | 0 |
| 0.7715277777777777 | 0 |
| 0.7722222222222223 | 0 |
| 0.7729166666666667 | 0 |
| 0.7736111111111111 | 0 |
| 0.7743055555555555 | 0 |
| 0.775 | 0 |
| 0.7756944444444445 | 0 |
| 0.7763888888888889 | 0 |
| 0.7770833333333332 | 0 |
| 0.7777777777777778 | 0 |
| 0.7784722222222222 | 0 |
| 0.7791666666666667 | 0 |
| 0.779861111111111 | 0 |
| 0.7805555555555556 | 0 |
| 0.78125 | 0 |
| 0.7819444444444444 | 0 |
| 0.782638888888889 | 0 |
| 0.7833333333333333 | 0 |
| 0.7840277777777778 | 0 |
| 0.7847222222222222 | 0 |
| 0.7854166666666668 | 0 |
| 0.7861111111111111 | 0 |
| 0.7868055555555555 | 0 |
| 0.7875 | 0 |
| 0.7881944444444445 | 0 |
| 0.7888888888888889 | 0 |
| 0.7895833333333333 | 0 |
| 0.7902777777777777 | 0 |
| 0.7909722222222223 | 0 |
| 0.7916666666666666 | 0 |
| 0.7923611111111111 | 0 |
| 0.7930555555555556 | 0 |
| 0.7937500000000001 | 0 |
| 0.7944444444444444 | 0 |
| 0.7951388888888888 | 0 |
| 0.7958333333333334 | 0 |
| 0.7965277777777778 | 0 |
| 0.7972222222222222 | 0 |
| 0.7979166666666666 | 0 |
| 0.7986111111111112 | 0 |
| 0.7993055555555556 | 0 |
| 0.7999999999999999 | 0 |
| 0.8006944444444444 | 0 |
| 0.8013888888888889 | 0 |
| 0.8020833333333334 | 0 |
| 0.8027777777777777 | 0 |
| 0.8034722222222223 | 0 |
| 0.8041666666666667 | 0 |
| 0.8048611111111111 | 0 |
| 0.8055555555555555 | 0 |
| 0.80625 | 0 |
| 0.8069444444444445 | 0 |
| 0.8076388888888889 | 0 |
| 0.8083333333333332 | 0 |
| 0.8090277777777778 | 0 |
| 0.8097222222222222 | 0 |
| 0.8104166666666667 | 0 |
| 0.811111111111111 | 0 |
| 0.8118055555555556 | 0 |
| 0.8125 | 0 |
| 0.8131944444444444 | 0 |
| 0.813888888888889 | 0 |
| 0.8145833333333333 | 0 |
| 0.8152777777777778 | 0 |
| 0.8159722222222222 | 0 |
| 0.8166666666666668 | 0 |
| 0.8173611111111111 | 0 |
| 0.8180555555555555 | 0 |
| 0.81875 | 0 |
| 0.8194444444444445 | 0 |
| 0.8201388888888889 | 0 |
| 0.8208333333333333 | 0 |
| 0.8215277777777777 | 0 |
| 0.8222222222222223 | 0 |
| 0.8229166666666666 | 0 |
| 0.8236111111111111 | 0 |
| 0.8243055555555556 | 0 |
| 0.8250000000000001 | 0 |
| 0.8256944444444444 | 0 |
| 0.8263888888888888 | 0 |
| 0.8270833333333334 | 0 |
| 0.8277777777777778 | 0 |
| 0.8284722222222222 | 0 |
| 0.8291666666666666 | 0 |
| 0.8298611111111112 | 0 |
| 0.8305555555555556 | 0 |
| 0.8312499999999999 | 0 |
| 0.8319444444444444 | 0 |
| 0.8326388888888889 | 0 |
| 0.8333333333333334 | 0 |
| 0.8340277777777777 | 0 |
| 0.8347222222222223 | 0 |
| 0.8354166666666667 | 0 |
| 0.8361111111111111 | 0 |
| 0.8368055555555555 | 0 |
| 0.8375 | 0 |
| 0.8381944444444445 | 0 |
| 0.8388888888888889 | 0 |
| 0.8395833333333332 | 0 |
| 0.8402777777777778 | 0 |
| 0.8409722222222222 | 0 |
| 0.8416666666666667 | 0 |
| 0.842361111111111 | 0 |
| 0.8430555555555556 | 0 |
| 0.84375 | 0 |
| 0.8444444444444444 | 0 |
| 0.845138888888889 | 0 |
| 0.8458333333333333 | 0 |
| 0.8465277777777778 | 0 |
| 0.8472222222222222 | 0 |
| 0.8479166666666668 | 0 |
| 0.8486111111111111 | 0 |
| 0.8493055555555555 | 0 |
| 0.85 | 0 |
| 0.8506944444444445 | 0 |
| 0.8513888888888889 | 0 |
| 0.8520833333333333 | 0 |
| 0.8527777777777777 | 0 |
| 0.8534722222222223 | 0 |
| 0.8541666666666666 | 0 |
| 0.8548611111111111 | 0 |
| 0.8555555555555556 | 0 |
| 0.8562500000000001 | 0 |
| 0.8569444444444444 | 0 |
| 0.8576388888888888 | 0 |
| 0.8583333333333334 | 0 |
| 0.8590277777777778 | 0 |
| 0.8597222222222222 | 0 |
| 0.8604166666666666 | 0 |
| 0.8611111111111112 | 0 |
| 0.8618055555555556 | 0 |
| 0.8624999999999999 | 0 |
| 0.8631944444444444 | 0 |
| 0.8638888888888889 | 0 |
| 0.8645833333333334 | 0 |
| 0.8652777777777777 | 0 |
| 0.8659722222222223 | 0 |
| 0.8666666666666667 | 0 |
| 0.8673611111111111 | 0 |
| 0.8680555555555555 | 0 |
| 0.86875 | 0 |
| 0.8694444444444445 | 0 |
| 0.8701388888888889 | 0 |
| 0.8708333333333332 | 0 |
| 0.8715277777777778 | 0 |
| 0.8722222222222222 | 0 |
| 0.8729166666666667 | 0 |
| 0.873611111111111 | 0 |
| 0.8743055555555556 | 0 |
| 0.875 | 0 |
| 0.8756944444444444 | 0 |
| 0.876388888888889 | 0 |
| 0.8770833333333333 | 0 |
| 0.8777777777777778 | 0 |
| 0.8784722222222222 | 0 |
| 0.8791666666666668 | 0 |
| 0.8798611111111111 | 0 |
| 0.8805555555555555 | 0 |
| 0.88125 | 0 |
| 0.8819444444444445 | 0 |
| 0.8826388888888889 | 0 |
| 0.8833333333333333 | 0 |
| 0.8840277777777777 | 0 |
| 0.8847222222222223 | 0 |
| 0.8854166666666666 | 0 |
| 0.8861111111111111 | 0 |
| 0.8868055555555556 | 0 |
| 0.8875000000000001 | 0 |
| 0.8881944444444444 | 0 |
| 0.8888888888888888 | 0 |
| 0.8895833333333334 | 0 |
| 0.8902777777777778 | 0 |
| 0.8909722222222222 | 0 |
| 0.8916666666666666 | 0 |
| 0.8923611111111112 | 0 |
| 0.8930555555555556 | 0 |
| 0.8937499999999999 | 0 |
| 0.8944444444444444 | 0 |
| 0.8951388888888889 | 0 |
| 0.8958333333333334 | 0 |
| 0.8965277777777777 | 0 |
| 0.8972222222222223 | 0 |
| 0.8979166666666667 | 0 |
| 0.8986111111111111 | 0 |
| 0.8993055555555555 | 0 |
| 0.9 | 0 |
| 0.9006944444444445 | 0 |
| 0.9013888888888889 | 0 |
| 0.9020833333333332 | 0 |
| 0.9027777777777778 | 0 |
| 0.9034722222222222 | 0 |
| 0.9041666666666667 | 0 |
| 0.904861111111111 | 0 |
| 0.9055555555555556 | 0 |
| 0.90625 | 0 |
| 0.9069444444444444 | 0 |
| 0.907638888888889 | 0 |
| 0.9083333333333333 | 0 |
| 0.9090277777777778 | 0 |
| 0.9097222222222222 | 0 |
| 0.9104166666666668 | 0 |
| 0.9111111111111111 | 0 |
| 0.9118055555555555 | 0 |
| 0.9125 | 0 |
| 0.9131944444444445 | 0 |
| 0.9138888888888889 | 0 |
| 0.9145833333333333 | 0 |
| 0.9152777777777777 | 0 |
| 0.9159722222222223 | 0 |
| 0.9166666666666666 | 0 |
| 0.9173611111111111 | 0 |
| 0.9180555555555556 | 0 |
| 0.9187500000000001 | 0 |
| 0.9194444444444444 | 0 |
| 0.9201388888888888 | 0 |
| 0.9208333333333334 | 0 |
| 0.9215277777777778 | 0 |
| 0.9222222222222222 | 0 |
| 0.9229166666666666 | 0 |
| 0.9236111111111112 | 0 |
| 0.9243055555555556 | 0 |
| 0.9249999999999999 | 0 |
| 0.9256944444444444 | 0 |
| 0.9263888888888889 | 0 |
| 0.9270833333333334 | 0 |
| 0.9277777777777777 | 0 |
| 0.9284722222222223 | 0 |
| 0.9291666666666667 | 0 |
| 0.9298611111111111 | 0 |
| 0.9305555555555555 | 0 |
| 0.93125 | 0 |
| 0.9319444444444445 | 0 |
| 0.9326388888888889 | 0 |
| 0.9333333333333332 | 0 |
| 0.9340277777777778 | 0 |
| 0.9347222222222222 | 0 |
| 0.9354166666666667 | 0 |
| 0.936111111111111 | 0 |
| 0.9368055555555556 | 0 |
| 0.9375 | 0 |
| 0.9381944444444444 | 0 |
| 0.938888888888889 | 0 |
| 0.9395833333333333 | 0 |
| 0.9402777777777778 | 0 |
| 0.9409722222222222 | 0 |
| 0.9416666666666668 | 0 |
| 0.9423611111111111 | 0 |
| 0.9430555555555555 | 0 |
| 0.94375 | 0 |
| 0.9444444444444445 | 0 |
| 0.9451388888888889 | 0 |
| 0.9458333333333333 | 0 |
| 0.9465277777777777 | 0 |
| 0.9472222222222223 | 0 |
| 0.9479166666666666 | 0 |
| 0.9486111111111111 | 0 |
| 0.9493055555555556 | 0 |
| 0.9500000000000001 | 0 |
| 0.9506944444444444 | 0 |
| 0.9513888888888888 | 0 |
| 0.9520833333333334 | 0 |
| 0.9527777777777778 | 0 |
| 0.9534722222222222 | 0 |
| 0.9541666666666666 | 0 |
| 0.9548611111111112 | 0 |
| 0.9555555555555556 | 0 |
| 0.9562499999999999 | 0 |
| 0.9569444444444444 | 0 |
| 0.9576388888888889 | 0 |
| 0.9583333333333334 | 0 |
| 0.9590277777777777 | 0 |
| 0.9597222222222223 | 0 |
| 0.9604166666666667 | 0 |
| 0.9611111111111111 | 0 |
| 0.9618055555555555 | 0 |
| 0.9625 | 0 |
| 0.9631944444444445 | 0 |
| 0.9638888888888889 | 0 |
| 0.9645833333333332 | 0 |
| 0.9652777777777778 | 0 |
| 0.9659722222222222 | 0 |
| 0.9666666666666667 | 0 |
| 0.967361111111111 | 0 |
| 0.9680555555555556 | 0 |
| 0.96875 | 0 |
| 0.9694444444444444 | 0 |
| 0.970138888888889 | 0 |
| 0.9708333333333333 | 0 |
| 0.9715277777777778 | 0 |
| 0.9722222222222222 | 0 |
| 0.9729166666666668 | 0 |
| 0.9736111111111111 | 0 |
| 0.9743055555555555 | 0 |
| 0.975 | 0 |
| 0.9756944444444445 | 0 |
| 0.9763888888888889 | 0 |
| 0.9770833333333333 | 0 |
| 0.9777777777777777 | 0 |
| 0.9784722222222223 | 0 |
| 0.9791666666666666 | 0 |
| 0.9798611111111111 | 0 |
| 0.9805555555555556 | 0 |
| 0.9812500000000001 | 0 |
| 0.9819444444444444 | 0 |
| 0.9826388888888888 | 0 |
| 0.9833333333333334 | 0 |
| 0.9840277777777778 | 0 |
| 0.9847222222222222 | 0 |
| 0.9854166666666666 | 0 |
| 0.9861111111111112 | 0 |
| 0.9868055555555556 | 0 |
| 0.9874999999999999 | 0 |
| 0.9881944444444444 | 0 |
| 0.9888888888888889 | 0 |
| 0.9895833333333334 | 0 |
| 0.9902777777777777 | 0 |
| 0.9909722222222223 | 0 |
| 0.9916666666666667 | 0 |
| 0.9923611111111111 | 0 |
| 0.9930555555555555 | 0 |
| 0.99375 | 0 |
| 0.9944444444444445 | 0 |
| 0.9951388888888889 | 0 |
| 0.9958333333333332 | 0 |
| 0.9965277777777778 | 0 |
| 0.9972222222222222 | 0 |
| 0.9979166666666667 | 0 |
| 0.998611111111111 | 0 |
| 0.9993055555555556 | 0 |